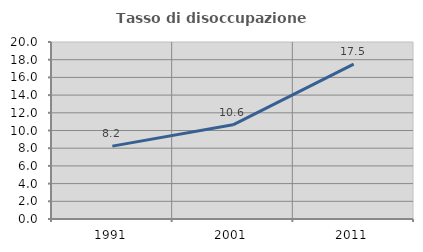
| Category | Tasso di disoccupazione giovanile  |
|---|---|
| 1991.0 | 8.235 |
| 2001.0 | 10.638 |
| 2011.0 | 17.5 |